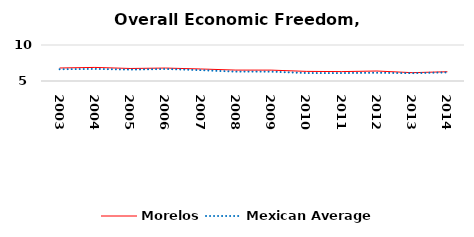
| Category | Morelos | Mexican Average  |
|---|---|---|
| 2003.0 | 6.807 | 6.632 |
| 2004.0 | 6.886 | 6.678 |
| 2005.0 | 6.74 | 6.582 |
| 2006.0 | 6.797 | 6.668 |
| 2007.0 | 6.671 | 6.508 |
| 2008.0 | 6.516 | 6.3 |
| 2009.0 | 6.511 | 6.3 |
| 2010.0 | 6.336 | 6.105 |
| 2011.0 | 6.306 | 6.103 |
| 2012.0 | 6.385 | 6.144 |
| 2013.0 | 6.159 | 6.087 |
| 2014.0 | 6.286 | 6.195 |